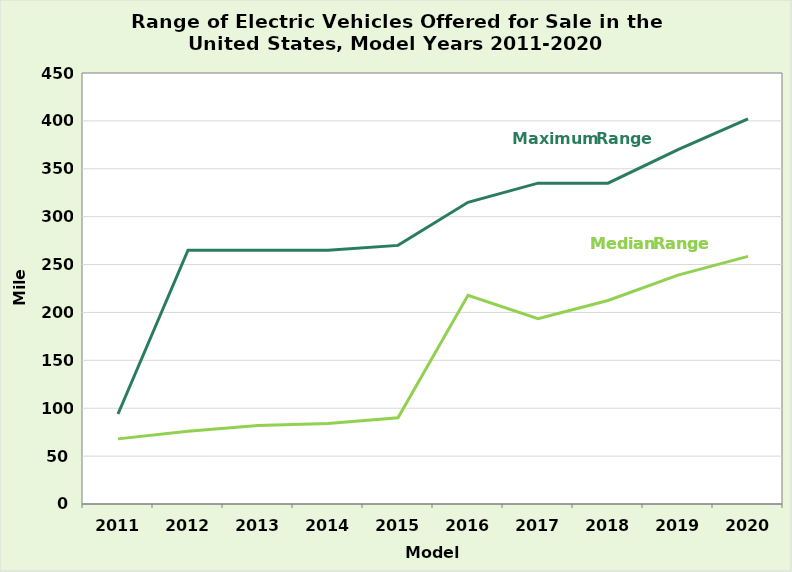
| Category | Median Range | Maximum Range |
|---|---|---|
| 2011.0 | 68 | 94 |
| 2012.0 | 76 | 265 |
| 2013.0 | 82 | 265 |
| 2014.0 | 84 | 265 |
| 2015.0 | 90 | 270 |
| 2016.0 | 218 | 315 |
| 2017.0 | 193.5 | 335 |
| 2018.0 | 212.5 | 335 |
| 2019.0 | 239 | 370 |
| 2020.0 | 258.5 | 402 |